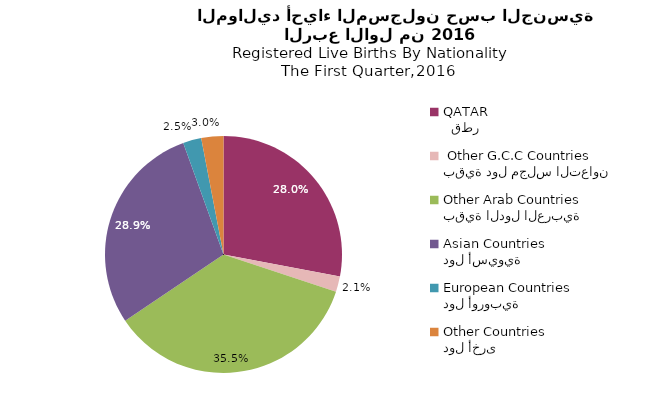
| Category | Series 1 |
|---|---|
|   قطر
QATAR | 1735 |
| بقية دول مجلس التعاون
 Other G.C.C Countries | 130 |
| بقية الدول العربية
Other Arab Countries | 2200 |
| دول أسيوية
Asian Countries | 1792 |
| دول أوروبية
European Countries | 155 |
| دول أخرى
Other Countries | 187 |